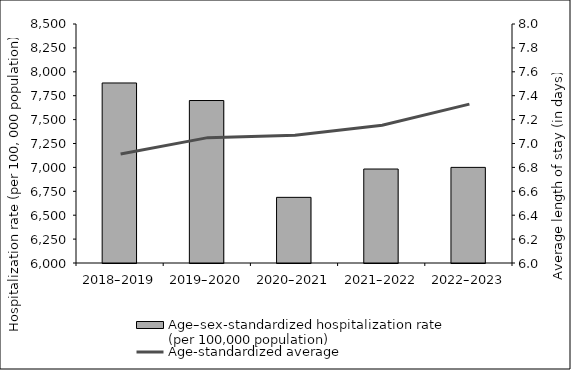
| Category | Age–sex-standardized hospitalization rate 
(per 100,000 population) |
|---|---|
| 2018–2019 | 7883.11 |
| 2019–2020 | 7699.481 |
| 2020–2021 | 6686.675 |
| 2021–2022 | 6982.958 |
| 2022–2023 | 7000.253 |